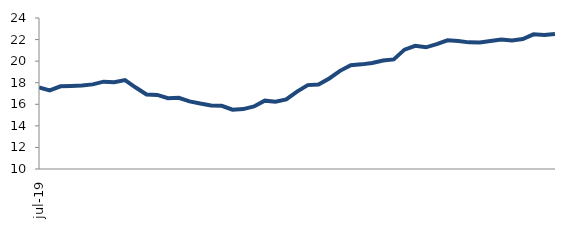
| Category | Series 0 |
|---|---|
| 2019-07-01 | 17.56 |
| 2019-08-01 | 17.291 |
| 2019-09-01 | 17.666 |
| 2019-10-01 | 17.704 |
| 2019-11-01 | 17.747 |
| 2019-12-01 | 17.844 |
| 2020-01-01 | 18.099 |
| 2020-02-01 | 18.039 |
| 2020-03-01 | 18.244 |
| 2020-04-01 | 17.551 |
| 2020-05-01 | 16.911 |
| 2020-06-01 | 16.867 |
| 2020-07-01 | 16.563 |
| 2020-08-01 | 16.602 |
| 2020-09-01 | 16.272 |
| 2020-10-01 | 16.069 |
| 2020-11-01 | 15.889 |
| 2020-12-01 | 15.855 |
| 2021-01-01 | 15.501 |
| 2021-02-01 | 15.555 |
| 2021-03-01 | 15.803 |
| 2021-04-01 | 16.335 |
| 2021-05-01 | 16.232 |
| 2021-06-01 | 16.452 |
| 2021-07-01 | 17.177 |
| 2021-08-01 | 17.778 |
| 2021-09-01 | 17.842 |
| 2021-10-01 | 18.396 |
| 2021-11-01 | 19.101 |
| 2021-12-01 | 19.622 |
| 2022-01-01 | 19.702 |
| 2022-02-01 | 19.825 |
| 2022-03-01 | 20.061 |
| 2022-04-01 | 20.163 |
| 2022-05-01 | 21.067 |
| 2022-06-01 | 21.42 |
| 2022-07-01 | 21.282 |
| 2022-08-01 | 21.579 |
| 2022-09-01 | 21.932 |
| 2022-10-01 | 21.875 |
| 2022-11-01 | 21.741 |
| 2022-12-01 | 21.732 |
| 2023-01-01 | 21.858 |
| 2023-02-01 | 21.995 |
| 2023-03-01 | 21.919 |
| 2023-04-01 | 22.045 |
| 2023-05-01 | 22.483 |
| 2023-06-01 | 22.416 |
| 2023-07-01 | 22.523 |